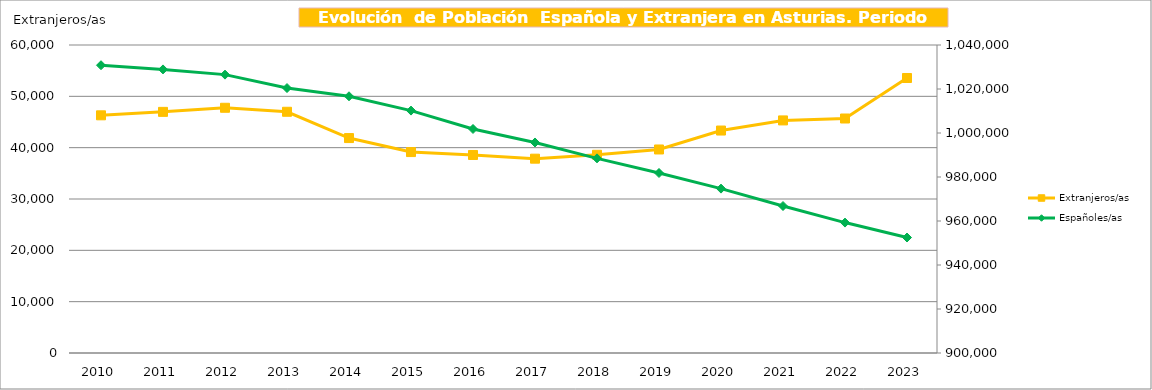
| Category | Extranjeros/as |
|---|---|
| 2010.0 | 46300 |
| 2011.0 | 46973 |
| 2012.0 | 47772 |
| 2013.0 | 46993 |
| 2014.0 | 41869 |
| 2015.0 | 39142 |
| 2016.0 | 38576 |
| 2017.0 | 37856 |
| 2018.0 | 38614 |
| 2019.0 | 39647 |
| 2020.0 | 43337 |
| 2021.0 | 45309 |
| 2022.0 | 45679 |
| 2023.0 | 53572 |